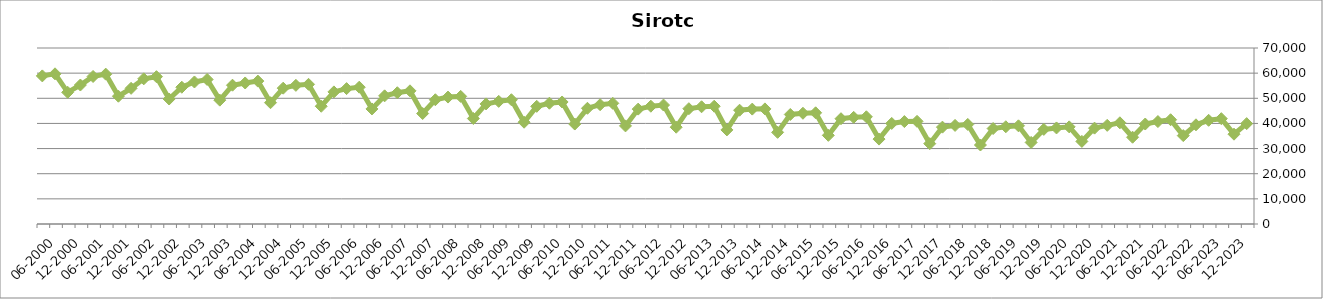
| Category | sirotci |
|---|---|
| 12-2023 | 39928 |
| 09-2023 | 35717 |
| 06-2023 | 41891 |
| 03-2023 | 41242 |
| 12-2022 | 39451 |
| 09-2022 | 35157 |
| 06-2022 | 41468 |
| 03-2022 | 40744 |
| 12-2021 | 39765 |
| 09-2021 | 34514 |
| 06-2021 | 40249 |
| 03-2021 | 39242 |
| 12-2020 | 38127 |
| 09-2020 | 32854 |
| 06-2020 | 38635 |
| 03-2020 | 38206 |
| 12-2019 | 37627 |
| 09-2019 | 32440 |
| 06-2019 | 39055 |
| 03-2019 | 38677 |
| 12-2018 | 37967 |
| 09-2018 | 31419 |
| 06-2018 | 39594 |
| 03-2018 | 39211 |
| 12-2017 | 38522 |
| 09-2017 | 31954 |
| 06-2017 | 40830 |
| 03-2017 | 40731 |
| 12-2016 | 39995 |
| 09-2016 | 33771 |
| 06-2016 | 42640 |
| 03-2016 | 42414 |
| 12-2015 | 41870 |
| 09-2015 | 35264 |
| 06-2015 | 44228 |
| 03-2015 | 44048 |
| 12-2014 | 43563 |
| 09-2014 | 36452 |
| 06-2014 | 45780 |
| 03-2014 | 45697 |
| 12-2013 | 45258 |
| 09-2013 | 37423 |
| 06-2013 | 46841 |
| 03-2013 | 46622 |
| 12-2012 | 45856 |
| 09-2012 | 38500 |
| 06-2012 | 47315 |
| 03-2012 | 46849 |
| 12-2011 | 45693 |
| 09-2011 | 39020 |
| 06-2011 | 47996 |
| 03-2011 | 47451 |
| 12-2010 | 46021 |
| 09-2010 | 39757 |
| 06-2010 | 48528 |
| 03-2010 | 48041 |
| 12-2009 | 46798 |
| 09-2009 | 40484 |
| 06-2009 | 49425 |
| 03-2009 | 48772 |
| 12-2008 | 47754 |
| 09-2008 | 41957 |
| 06-2008 | 50758 |
| 03-2008 | 50485 |
| 12-2007 | 49415 |
| 09-2007 | 43944 |
| 06-2007 | 52971 |
| 03-2007 | 52204 |
| 12-2006 | 50968 |
| 09-2006 | 45763 |
| 06-2006 | 54412 |
| 03-2006 | 53852 |
| 12-2005 | 52543 |
| 09-2005 | 46836 |
| 06-2005 | 55555 |
| 03-2005 | 55144 |
| 12-2004 | 54020 |
| 09-2004 | 48243 |
| 06-2004 | 56837 |
| 03-2004 | 56088 |
| 12-2003 | 55202 |
| 09-2003 | 49259 |
| 06-2003 | 57486 |
| 03-2003 | 56488 |
| 12-2002 | 54401 |
| 09-2002 | 49713 |
| 06-2002 | 58593 |
| 03-2002 | 57741 |
| 12-2001 | 53961 |
| 09-2001 | 50825 |
| 06-2001 | 59603 |
| 03-2001 | 58675 |
| 12-2000 | 55273 |
| 09-2000 | 52378 |
| 06-2000 | 59729 |
| 03-2000 | 58907 |